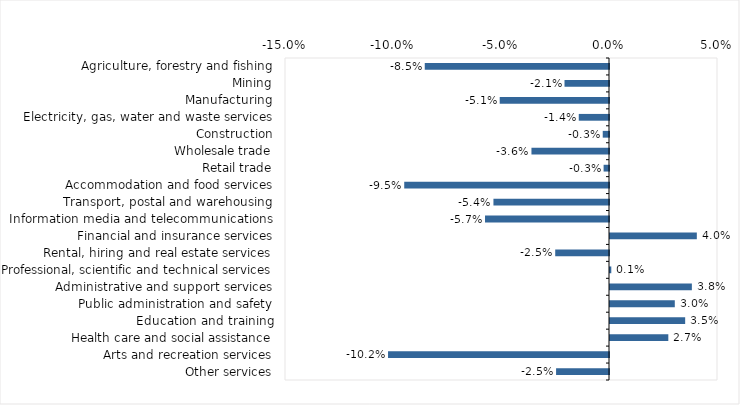
| Category | This week |
|---|---|
| Agriculture, forestry and fishing | -0.085 |
| Mining | -0.021 |
| Manufacturing | -0.051 |
| Electricity, gas, water and waste services | -0.014 |
| Construction | -0.003 |
| Wholesale trade | -0.036 |
| Retail trade | -0.002 |
| Accommodation and food services | -0.095 |
| Transport, postal and warehousing | -0.054 |
| Information media and telecommunications | -0.057 |
| Financial and insurance services | 0.04 |
| Rental, hiring and real estate services | -0.025 |
| Professional, scientific and technical services | 0.001 |
| Administrative and support services | 0.038 |
| Public administration and safety | 0.03 |
| Education and training | 0.035 |
| Health care and social assistance | 0.027 |
| Arts and recreation services | -0.102 |
| Other services | -0.024 |